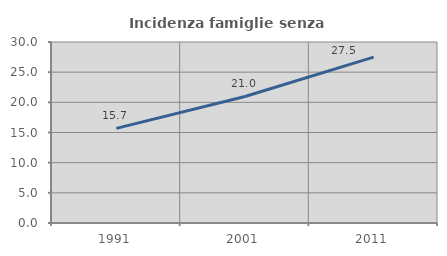
| Category | Incidenza famiglie senza nuclei |
|---|---|
| 1991.0 | 15.677 |
| 2001.0 | 20.968 |
| 2011.0 | 27.483 |